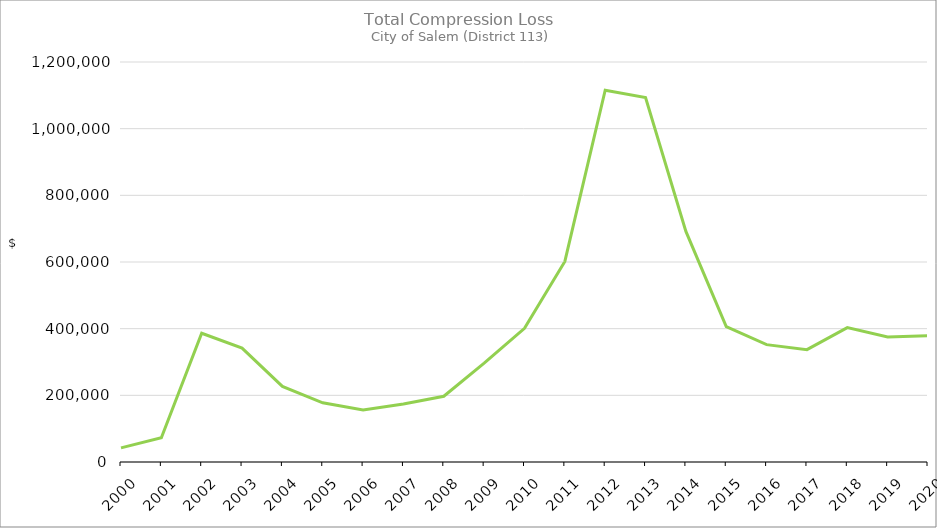
| Category | Series 0 |
|---|---|
| 2000.0 | 42252.58 |
| 2001.0 | 72950.85 |
| 2002.0 | 386257.62 |
| 2003.0 | 341663.73 |
| 2004.0 | 226677.5 |
| 2005.0 | 177509.01 |
| 2006.0 | 155744.19 |
| 2007.0 | 174309.64 |
| 2008.0 | 197327.15 |
| 2009.0 | 296400.27 |
| 2010.0 | 401017.46 |
| 2011.0 | 601783.94 |
| 2012.0 | 1115229.24 |
| 2013.0 | 1093203.81 |
| 2014.0 | 691654.19 |
| 2015.0 | 406384.51 |
| 2016.0 | 352121.11 |
| 2017.0 | 337105.85 |
| 2018.0 | 403286.65 |
| 2019.0 | 375299.37 |
| 2020.0 | 378553.35 |